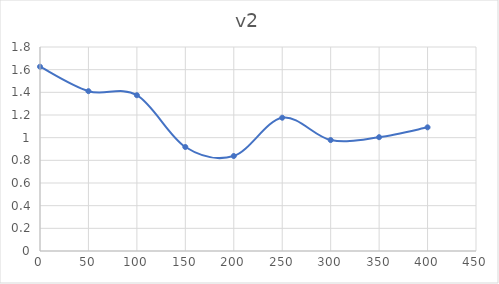
| Category | Series 0 |
|---|---|
| 0.0 | 1.626 |
| 50.0 | 1.41 |
| 100.0 | 1.374 |
| 150.0 | 0.918 |
| 200.0 | 0.838 |
| 250.0 | 1.176 |
| 300.0 | 0.979 |
| 350.0 | 1.004 |
| 400.0 | 1.091 |